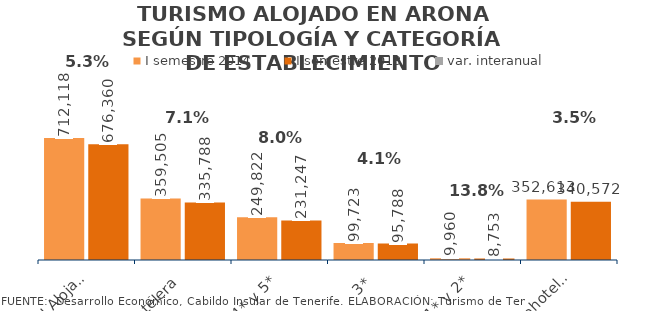
| Category | I semestre 2014 | I semestre 2013 |
|---|---|---|
| Total Alojados | 712118 | 676360 |
| Hotelera | 359505 | 335788 |
| 4* y 5* | 249822 | 231247 |
| 3* | 99723 | 95788 |
| 1* y 2* | 9960 | 8753 |
| Extrahotelera | 352613 | 340572 |